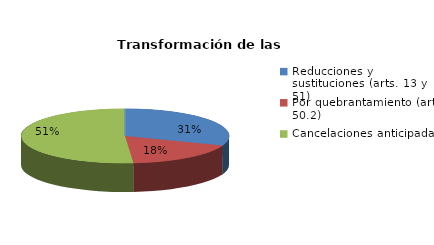
| Category | Series 0 |
|---|---|
| Reducciones y sustituciones (arts. 13 y 51) | 12 |
| Por quebrantamiento (art. 50.2) | 7 |
| Cancelaciones anticipadas | 20 |
| Traslado a Centros Penitenciarios | 0 |
| Conversión internamientos en cerrados (art. 51.2) | 0 |